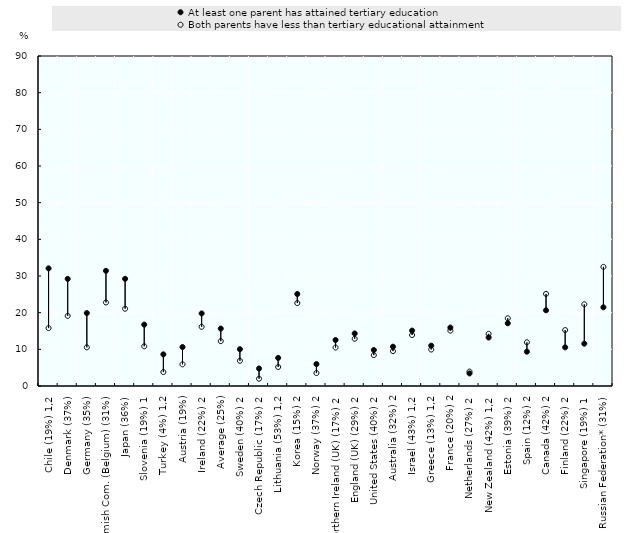
| Category | At least one parent has attained tertiary education | Both parents have less than tertiary educational attainment |
|---|---|---|
| Chile (19%) 1,2 | 32.083 | 15.787 |
| Denmark (37%) | 29.216 | 19.12 |
| Germany (35%) | 19.892 | 10.549 |
| Flemish Com. (Belgium) (31%) | 31.407 | 22.772 |
| Japan (36%) | 29.233 | 21.075 |
| Slovenia (19%) 1 | 16.744 | 10.825 |
| Turkey (4%) 1,2 | 8.627 | 3.801 |
| Austria (19%) | 10.615 | 5.909 |
| Ireland (22%) 2 | 19.793 | 16.139 |
| Average (25%) | 15.663 | 12.234 |
| Sweden (40%) 2 | 10.045 | 6.875 |
| Czech Republic (17%) 2 | 4.771 | 1.979 |
| Lithuania (53%) 1,2 | 7.661 | 5.181 |
| Korea (15%) 2 | 25.095 | 22.616 |
| Norway (37%) 2 | 5.979 | 3.529 |
| Northern Ireland (UK) (17%) 2 | 12.538 | 10.491 |
| England (UK) (29%) 2 | 14.325 | 12.893 |
| United States (40%) 2 | 9.81 | 8.416 |
| Australia (32%) 2 | 10.719 | 9.509 |
| Israel (43%) 1,2 | 15.106 | 13.899 |
| Greece (13%) 1,2 | 11.006 | 9.946 |
| France (20%) 2 | 15.934 | 15.111 |
| Netherlands (27%) 2 | 3.429 | 3.931 |
| New Zealand (42%) 1,2 | 13.223 | 14.225 |
| Estonia (39%) 2 | 17.103 | 18.466 |
| Spain (12%) 2 | 9.354 | 11.925 |
| Canada (42%) 2 | 20.649 | 25.124 |
| Finland (22%) 2 | 10.542 | 15.251 |
| Singapore (19%) 1 | 11.541 | 22.284 |
| Russian Federation* (31%) | 21.463 | 32.495 |